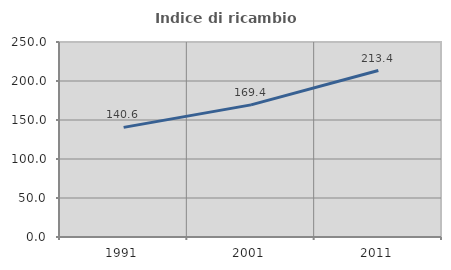
| Category | Indice di ricambio occupazionale  |
|---|---|
| 1991.0 | 140.559 |
| 2001.0 | 169.412 |
| 2011.0 | 213.4 |